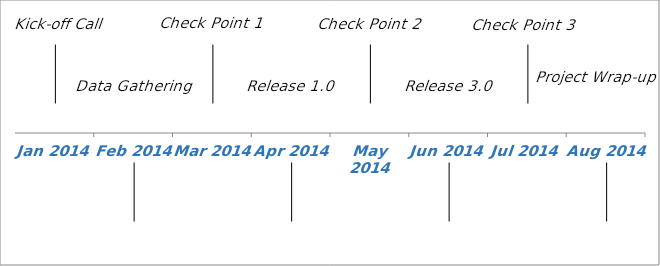
| Category | Series 1 |
|---|---|
| Kick-off Call | 10 |
| Data Gathering | -10 |
| Check Point 1 | 10 |
| Release 1.0 | -10 |
| Check Point 2 | 10 |
| Release 3.0 | -10 |
| Check Point 3 | 10 |
| Project Wrap-up | -10 |